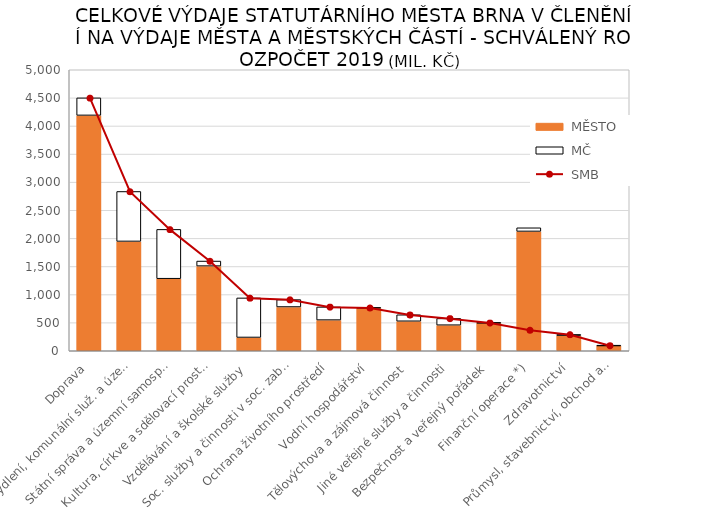
| Category |  MĚSTO |  MČ |
|---|---|---|
|  Doprava | 4188.147 | 311.728 |
|  Bydlení, komunální služ. a územ. rozvoj | 1945.39 | 888.916 |
|  Státní správa a územní samospráva | 1282.133 | 877.305 |
|  Kultura, církve a sdělovací prostředky | 1506.308 | 89.838 |
|  Vzdělávání a školské služby | 236.534 | 703.473 |
|  Soc. služby a činnosti v soc. zabezpečení | 778.541 | 131.752 |
|  Ochrana životního prostředí | 545.634 | 234.407 |
|  Vodní hospodářství | 761.781 | 3.736 |
|  Tělovýchova a zájmová činnost | 524.777 | 115.575 |
|  Jiné veřejné služby a činnosti | 455.001 | 120.265 |
|  Bezpečnost a veřejný pořádek | 495.621 | 1.07 |
|  Finanční operace *) | 2123.472 | 64.648 |
|  Zdravotnictví | 269.972 | 20.462 |
|  Průmysl, stavebnictví, obchod a služby | 90.492 | 2.785 |